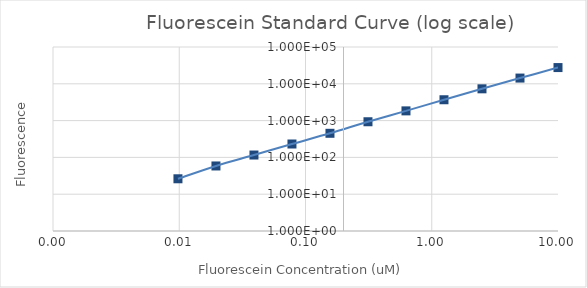
| Category | Series 1 |
|---|---|
| 10.0 | 27615 |
| 5.0 | 14312.5 |
| 2.5 | 7304.5 |
| 1.25 | 3686.75 |
| 0.625 | 1838.25 |
| 0.3125 | 930.5 |
| 0.15625 | 452 |
| 0.078125 | 231.25 |
| 0.0390625 | 116 |
| 0.01953125 | 58.5 |
| 0.009765625 | 26.25 |